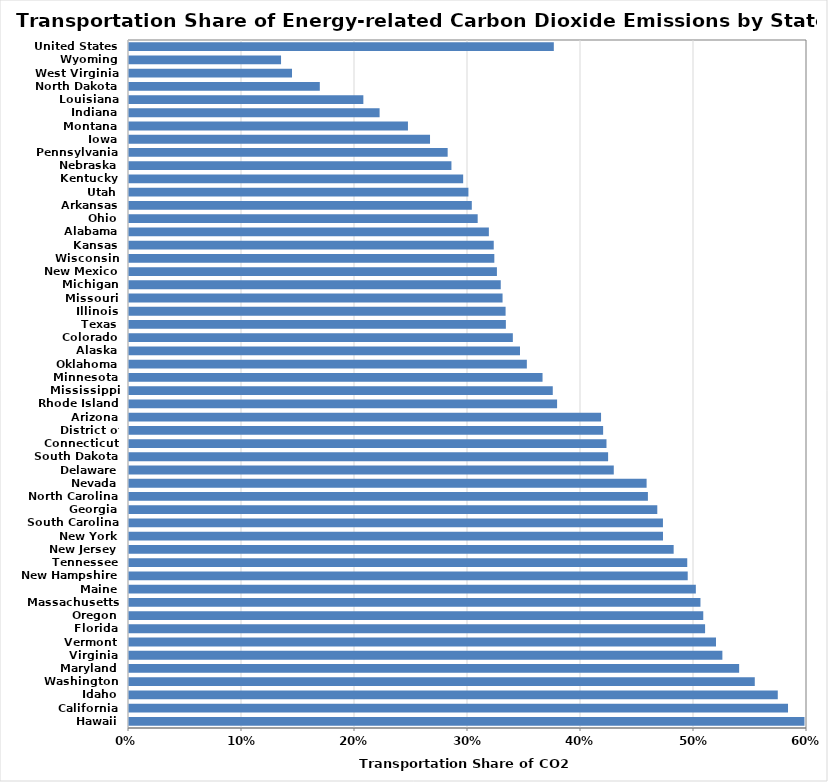
| Category | Transportation Share |
|---|---|
| Hawaii | 0.598 |
| California | 0.583 |
| Idaho | 0.574 |
| Washington | 0.554 |
| Maryland | 0.54 |
| Virginia | 0.525 |
| Vermont | 0.519 |
| Florida | 0.51 |
| Oregon | 0.508 |
| Massachusetts | 0.506 |
| Maine | 0.502 |
| New Hampshire | 0.494 |
| Tennessee | 0.494 |
| New Jersey | 0.482 |
| New York | 0.473 |
| South Carolina | 0.473 |
| Georgia | 0.468 |
| North Carolina | 0.459 |
| Nevada | 0.458 |
| Delaware | 0.429 |
| South Dakota | 0.424 |
| Connecticut | 0.423 |
| District of Columbia | 0.42 |
| Arizona | 0.418 |
| Rhode Island | 0.379 |
| Mississippi | 0.375 |
| Minnesota | 0.366 |
| Oklahoma | 0.352 |
| Alaska | 0.346 |
| Colorado | 0.34 |
| Texas | 0.334 |
| Illinois | 0.333 |
| Missouri | 0.331 |
| Michigan | 0.329 |
| New Mexico | 0.326 |
| Wisconsin | 0.323 |
| Kansas | 0.323 |
| Alabama | 0.318 |
| Ohio | 0.309 |
| Arkansas | 0.303 |
| Utah | 0.3 |
| Kentucky | 0.296 |
| Nebraska | 0.285 |
| Pennsylvania | 0.282 |
| Iowa | 0.266 |
| Montana | 0.247 |
| Indiana | 0.222 |
| Louisiana | 0.207 |
| North Dakota | 0.169 |
| West Virginia | 0.144 |
| Wyoming | 0.135 |
| United States | 0.376 |